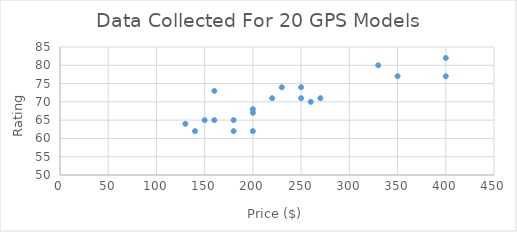
| Category | Rating  |
|---|---|
| 400.0 | 82 |
| 330.0 | 80 |
| 350.0 | 77 |
| 400.0 | 77 |
| 250.0 | 74 |
| 230.0 | 74 |
| 160.0 | 73 |
| 270.0 | 71 |
| 250.0 | 71 |
| 220.0 | 71 |
| 260.0 | 70 |
| 200.0 | 68 |
| 200.0 | 67 |
| 150.0 | 65 |
| 180.0 | 65 |
| 160.0 | 65 |
| 130.0 | 64 |
| 200.0 | 62 |
| 140.0 | 62 |
| 180.0 | 62 |